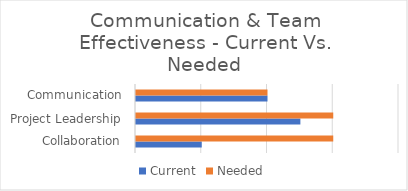
| Category | Current | Needed |
|---|---|---|
| Collaboration | 1 | 3 |
| Project Leadership | 2.5 | 3 |
| Communication | 2 | 2 |